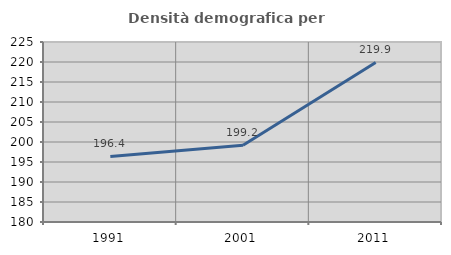
| Category | Densità demografica |
|---|---|
| 1991.0 | 196.404 |
| 2001.0 | 199.167 |
| 2011.0 | 219.893 |